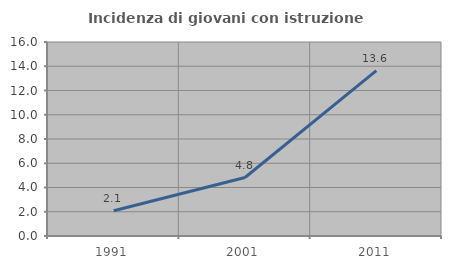
| Category | Incidenza di giovani con istruzione universitaria |
|---|---|
| 1991.0 | 2.083 |
| 2001.0 | 4.825 |
| 2011.0 | 13.636 |